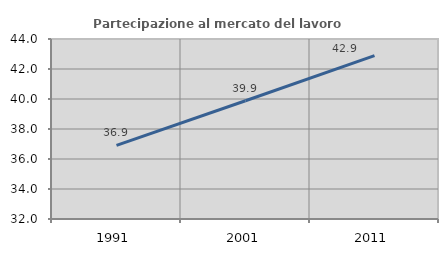
| Category | Partecipazione al mercato del lavoro  femminile |
|---|---|
| 1991.0 | 36.906 |
| 2001.0 | 39.881 |
| 2011.0 | 42.894 |